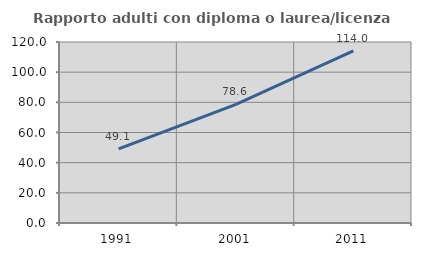
| Category | Rapporto adulti con diploma o laurea/licenza media  |
|---|---|
| 1991.0 | 49.123 |
| 2001.0 | 78.647 |
| 2011.0 | 114.04 |